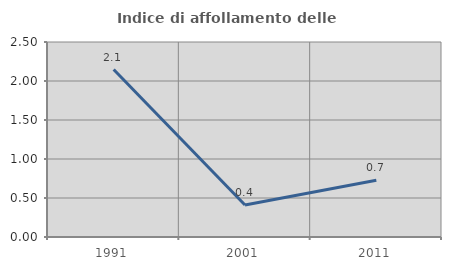
| Category | Indice di affollamento delle abitazioni  |
|---|---|
| 1991.0 | 2.146 |
| 2001.0 | 0.409 |
| 2011.0 | 0.728 |